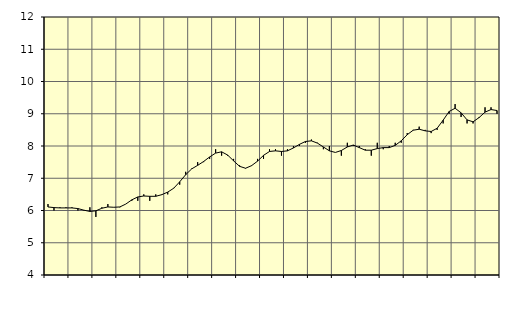
| Category | Piggar | Byggverksamhet, SNI 41-43 |
|---|---|---|
| nan | 6.2 | 6.11 |
| 1.0 | 6 | 6.09 |
| 1.0 | 6.1 | 6.08 |
| 1.0 | 6.1 | 6.08 |
| nan | 6.1 | 6.08 |
| 2.0 | 6 | 6.06 |
| 2.0 | 6 | 6.01 |
| 2.0 | 6.1 | 5.97 |
| nan | 5.8 | 5.99 |
| 3.0 | 6.1 | 6.07 |
| 3.0 | 6.2 | 6.11 |
| 3.0 | 6.1 | 6.1 |
| nan | 6.1 | 6.11 |
| 4.0 | 6.2 | 6.2 |
| 4.0 | 6.3 | 6.33 |
| 4.0 | 6.3 | 6.42 |
| nan | 6.5 | 6.45 |
| 5.0 | 6.3 | 6.44 |
| 5.0 | 6.5 | 6.44 |
| 5.0 | 6.5 | 6.49 |
| nan | 6.5 | 6.57 |
| 6.0 | 6.7 | 6.69 |
| 6.0 | 6.8 | 6.89 |
| 6.0 | 7.2 | 7.11 |
| nan | 7.3 | 7.29 |
| 7.0 | 7.5 | 7.4 |
| 7.0 | 7.5 | 7.52 |
| 7.0 | 7.6 | 7.66 |
| nan | 7.9 | 7.78 |
| 8.0 | 7.7 | 7.82 |
| 8.0 | 7.7 | 7.72 |
| 8.0 | 7.6 | 7.54 |
| nan | 7.4 | 7.37 |
| 9.0 | 7.3 | 7.31 |
| 9.0 | 7.4 | 7.39 |
| 9.0 | 7.6 | 7.53 |
| nan | 7.6 | 7.71 |
| 10.0 | 7.9 | 7.83 |
| 10.0 | 7.9 | 7.85 |
| 10.0 | 7.7 | 7.83 |
| nan | 7.9 | 7.85 |
| 11.0 | 8 | 7.94 |
| 11.0 | 8 | 8.05 |
| 11.0 | 8.1 | 8.14 |
| nan | 8.2 | 8.16 |
| 12.0 | 8.1 | 8.09 |
| 12.0 | 7.9 | 7.97 |
| 12.0 | 8 | 7.85 |
| nan | 7.8 | 7.8 |
| 13.0 | 7.7 | 7.86 |
| 13.0 | 8.1 | 7.97 |
| 13.0 | 8 | 8.03 |
| nan | 8 | 7.95 |
| 14.0 | 7.9 | 7.87 |
| 14.0 | 7.7 | 7.87 |
| 14.0 | 8.1 | 7.92 |
| nan | 7.9 | 7.95 |
| 15.0 | 8 | 7.95 |
| 15.0 | 8.1 | 8.02 |
| 15.0 | 8.1 | 8.16 |
| nan | 8.4 | 8.35 |
| 16.0 | 8.5 | 8.49 |
| 16.0 | 8.6 | 8.52 |
| 16.0 | 8.5 | 8.47 |
| nan | 8.4 | 8.45 |
| 17.0 | 8.5 | 8.55 |
| 17.0 | 8.7 | 8.8 |
| 17.0 | 9 | 9.07 |
| nan | 9.3 | 9.17 |
| 18.0 | 8.9 | 9.03 |
| 18.0 | 8.7 | 8.81 |
| 18.0 | 8.7 | 8.75 |
| nan | 8.9 | 8.88 |
| 19.0 | 9.2 | 9.05 |
| 19.0 | 9.2 | 9.13 |
| 19.0 | 9 | 9.1 |